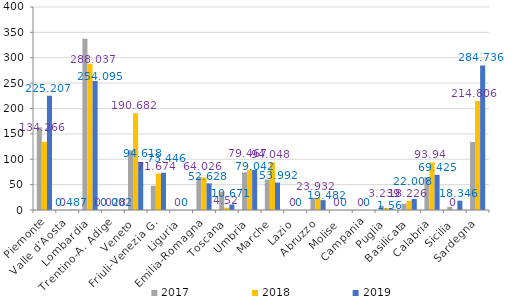
| Category | 2017 | 2018 | 2019 |
|---|---|---|---|
| Piemonte | 162.869 | 134.266 | 225.207 |
| Valle d’Aosta | 0.13 | 0 | 0.487 |
| Lombardia | 337.351 | 288.037 | 254.095 |
| Trentino-A. Adige | 0.093 | 0.028 | 0.002 |
| Veneto | 117.665 | 190.682 | 94.618 |
| Friuli-Venezia G. | 47.688 | 71.674 | 73.446 |
| Liguria | 0 | 0 | 0 |
| Emilia-Romagna | 65.079 | 64.026 | 52.628 |
| Toscana | 36.069 | 4.52 | 10.671 |
| Umbria | 74.261 | 79.467 | 79.042 |
| Marche | 59.949 | 94.048 | 53.992 |
| Lazio | 0 | 0 | 0 |
| Abruzzo | 24.329 | 23.932 | 19.482 |
| Molise | 0 | 0 | 0 |
| Campania | 0 | 0 | 0 |
| Puglia | 8.039 | 3.239 | 1.56 |
| Basilicata | 12.541 | 18.226 | 22.008 |
| Calabria | 64.601 | 93.94 | 69.425 |
| Sicilia | 6.039 | 0 | 18.346 |
| Sardegna | 134.078 | 214.806 | 284.736 |